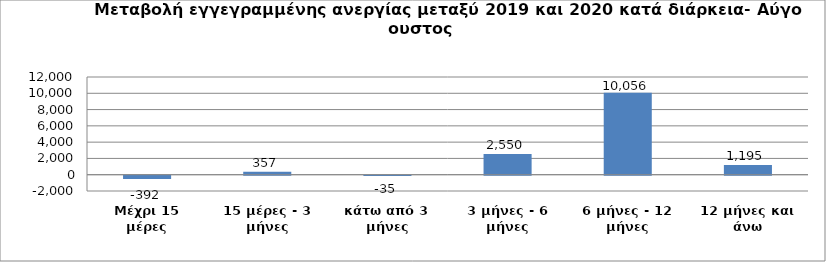
| Category | Series 0 |
|---|---|
| Μέχρι 15 μέρες | -392 |
| 15 μέρες - 3 μήνες | 357 |
| κάτω από 3 μήνες | -35 |
| 3 μήνες - 6 μήνες | 2550 |
| 6 μήνες - 12 μήνες | 10056 |
| 12 μήνες και άνω | 1195 |